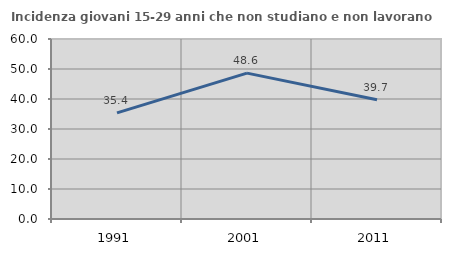
| Category | Incidenza giovani 15-29 anni che non studiano e non lavorano  |
|---|---|
| 1991.0 | 35.392 |
| 2001.0 | 48.619 |
| 2011.0 | 39.744 |